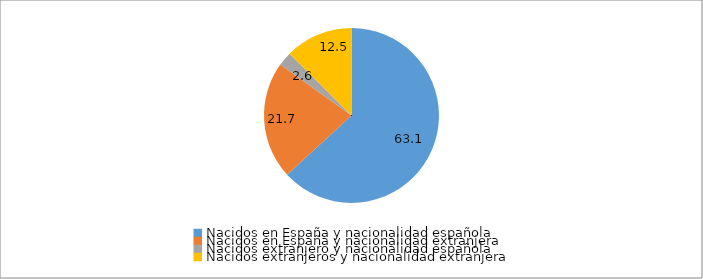
| Category | Series 0 |
|---|---|
| Nacidos en España y nacionalidad española | 63.1 |
| Nacidos en España y nacionalidad extranjera | 21.7 |
| Nacidos extranjero y nacionalidad española | 2.6 |
| Nacidos extranjeros y nacionalidad extranjera | 12.5 |